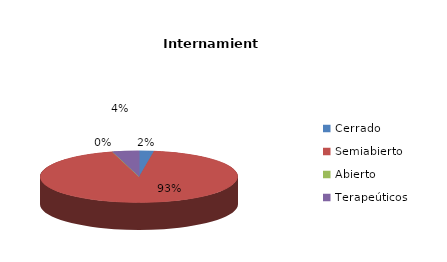
| Category | Series 0 |
|---|---|
| Cerrado | 5 |
| Semiabierto | 195 |
| Abierto | 0 |
| Terapeúticos | 9 |